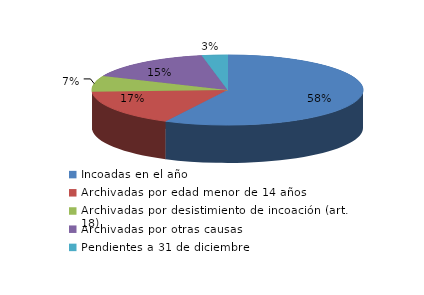
| Category | Series 0 |
|---|---|
| Incoadas en el año | 1402 |
| Archivadas por edad menor de 14 años | 406 |
| Archivadas por desistimiento de incoación (art. 18) | 180 |
| Archivadas por otras causas | 375 |
| Pendientes a 31 de diciembre | 74 |